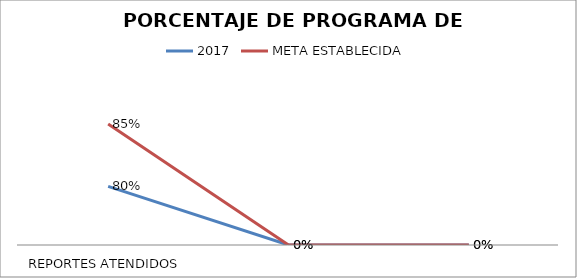
| Category | 2017 | META ESTABLECIDA |
|---|---|---|
| REPORTES ATENDIDOS | 0.8 | 0.85 |